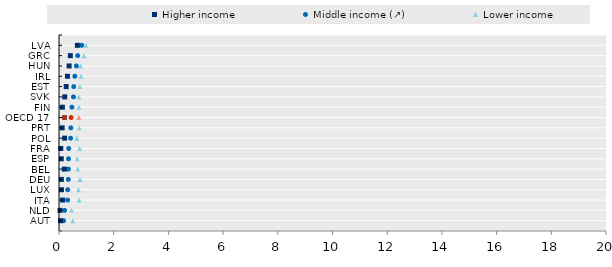
| Category | Series 0 |
|---|---|
|  | 0 |
| AUT | 1 |
| NLD | 2 |
| ITA | 3 |
| LUX | 4 |
| DEU | 5 |
| BEL | 6 |
| ESP | 7 |
| FRA | 8 |
| POL | 9 |
| PRT | 10 |
| OECD 17 | 11 |
| FIN | 12 |
| SVK | 13 |
| EST | 14 |
| IRL | 15 |
| HUN | 16 |
| GRC | 17 |
| LVA | 18 |